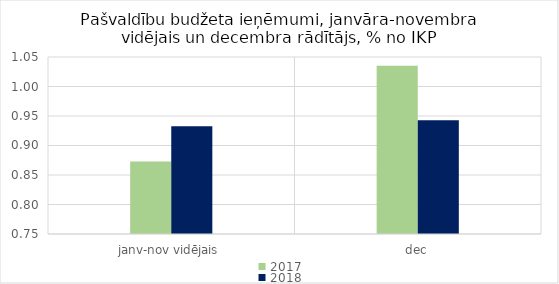
| Category | 2017 | 2018 |
|---|---|---|
| janv-nov vidējais | 0.873 | 0.932 |
| dec | 1.035 | 0.943 |